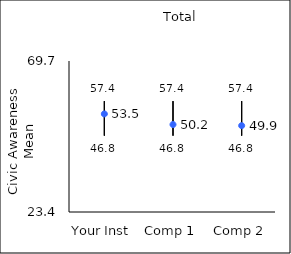
| Category | 25th percentile | 75th percentile | Mean |
|---|---|---|---|
| Your Inst | 46.8 | 57.4 | 53.48 |
| Comp 1 | 46.8 | 57.4 | 50.22 |
| Comp 2 | 46.8 | 57.4 | 49.88 |